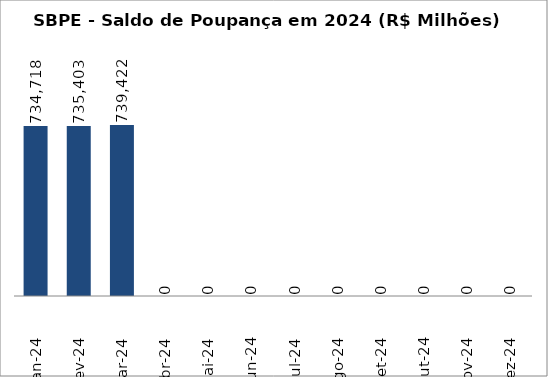
| Category | SBPE - Saldo de Poupança em 2024 (R$ Milhões) |
|---|---|
| Jan-24 | 734718.488 |
| Fev-24 | 735403.254 |
| Mar-24 | 739421.538 |
| Abr-24 | 0 |
| Mai-24 | 0 |
| Jun-24 | 0 |
| Jul-24 | 0 |
| Ago-24 | 0 |
| Set-24 | 0 |
| Out-24 | 0 |
| Nov-24 | 0 |
| Dez-24 | 0 |